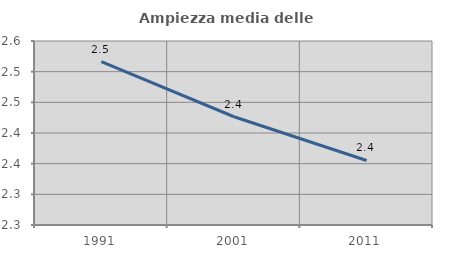
| Category | Ampiezza media delle famiglie |
|---|---|
| 1991.0 | 2.516 |
| 2001.0 | 2.427 |
| 2011.0 | 2.355 |